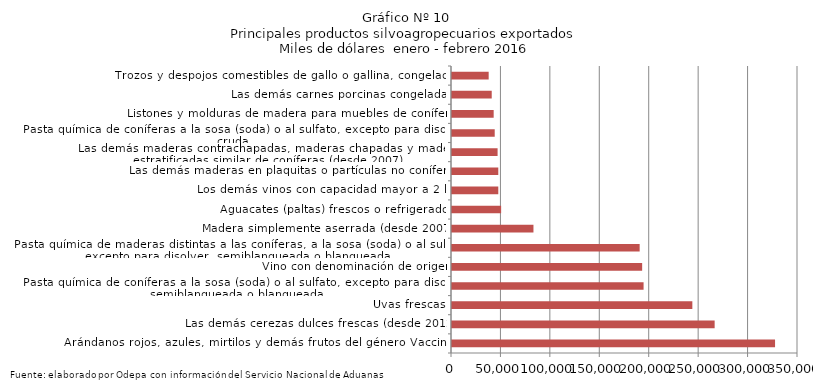
| Category | Series 0 |
|---|---|
| Arándanos rojos, azules, mirtilos y demás frutos del género Vaccinium | 326792.029 |
| Las demás cerezas dulces frescas (desde 2012) | 265686.171 |
| Uvas frescas | 243121.46 |
| Pasta química de coníferas a la sosa (soda) o al sulfato, excepto para disolver, semiblanqueada o blanqueada | 193795.295 |
| Vino con denominación de origen | 192350.73 |
| Pasta química de maderas distintas a las coníferas, a la sosa (soda) o al sulfato, excepto para disolver, semiblanqueada o blanqueada | 189829.474 |
| Madera simplemente aserrada (desde 2007) | 82397.974 |
| Aguacates (paltas) frescos o refrigerados | 49698.391 |
| Los demás vinos con capacidad mayor a 2 lts | 46831.465 |
| Las demás maderas en plaquitas o partículas no coníferas | 46825.577 |
| Las demás maderas contrachapadas, maderas chapadas y maderas estratificadas similar de coníferas (desde 2007) | 46118.115 |
| Pasta química de coníferas a la sosa (soda) o al sulfato, excepto para disolver, cruda | 43209.291 |
| Listones y molduras de madera para muebles de coníferas | 42156.198 |
| Las demás carnes porcinas congeladas | 40189.644 |
| Trozos y despojos comestibles de gallo o gallina, congelados | 37096.78 |